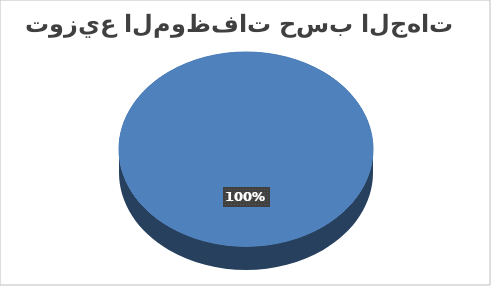
| Category | مصالح مركزية |
|---|---|
| إناث | 186 |